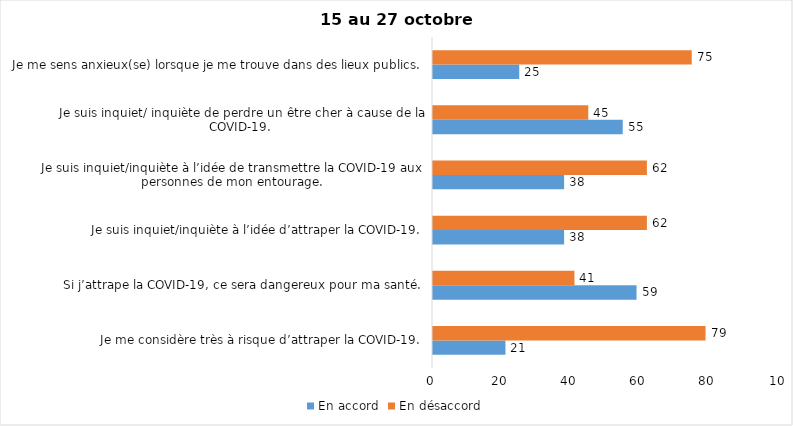
| Category | En accord | En désaccord |
|---|---|---|
| Je me considère très à risque d’attraper la COVID-19. | 21 | 79 |
| Si j’attrape la COVID-19, ce sera dangereux pour ma santé. | 59 | 41 |
| Je suis inquiet/inquiète à l’idée d’attraper la COVID-19. | 38 | 62 |
| Je suis inquiet/inquiète à l’idée de transmettre la COVID-19 aux personnes de mon entourage. | 38 | 62 |
| Je suis inquiet/ inquiète de perdre un être cher à cause de la COVID-19. | 55 | 45 |
| Je me sens anxieux(se) lorsque je me trouve dans des lieux publics. | 25 | 75 |